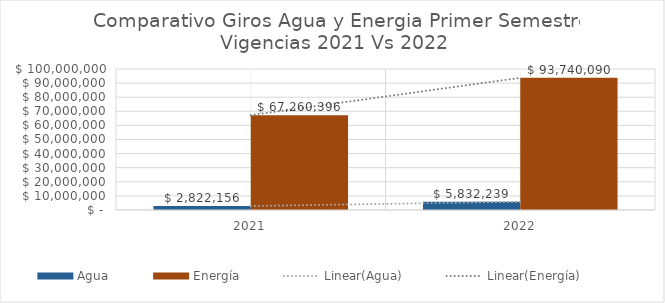
| Category | Agua | Energía |
|---|---|---|
| 0 | 2822156 | 67260396 |
| 1 | 5832239 | 93740090 |